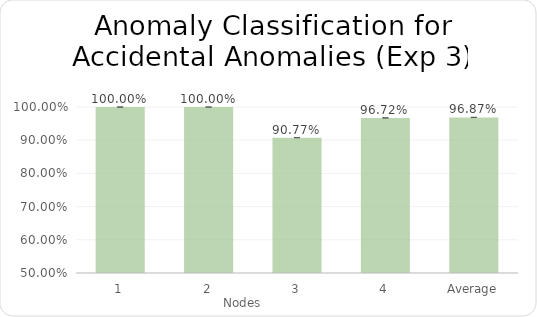
| Category | Precision |
|---|---|
| 1 | 1 |
| 2 | 1 |
| 3 | 0.908 |
| 4 | 0.967 |
| Average | 0.969 |